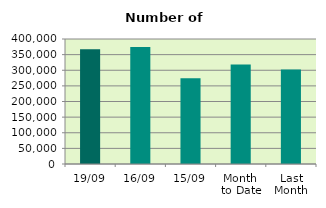
| Category | Series 0 |
|---|---|
| 19/09 | 367528 |
| 16/09 | 374398 |
| 15/09 | 274284 |
| Month 
to Date | 318461.385 |
| Last
Month | 302693.565 |